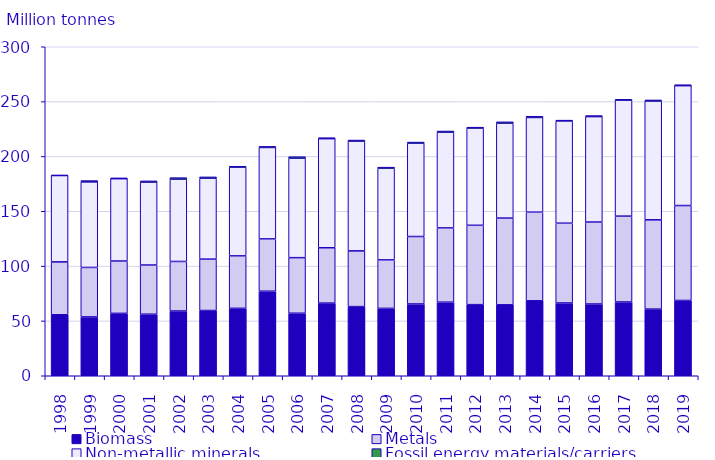
| Category | Biomass | Metals | Non-metallic minerals | Fossil energy materials/carriers |
|---|---|---|---|---|
| 1998.0 | 55.605 | 48.234 | 78.756 | 0.319 |
| 1999.0 | 53.658 | 45.113 | 77.989 | 1.234 |
| 2000.0 | 56.896 | 47.732 | 75.055 | 0.712 |
| 2001.0 | 56.119 | 44.862 | 75.561 | 1.169 |
| 2002.0 | 59.06 | 45.156 | 75.047 | 1.406 |
| 2003.0 | 59.466 | 46.889 | 73.732 | 1.243 |
| 2004.0 | 61.477 | 47.83 | 80.845 | 0.894 |
| 2005.0 | 77.099 | 47.687 | 83.378 | 1 |
| 2006.0 | 57.006 | 50.691 | 90.646 | 1.427 |
| 2007.0 | 66.256 | 50.466 | 99.471 | 0.878 |
| 2008.0 | 63.046 | 50.844 | 99.977 | 1.071 |
| 2009.0 | 61.433 | 44.222 | 83.551 | 1.002 |
| 2010.0 | 65.456 | 61.516 | 85.067 | 1.039 |
| 2011.0 | 67.104 | 67.717 | 87.229 | 1.125 |
| 2012.0 | 64.829 | 72.374 | 88.61 | 0.847 |
| 2013.0 | 64.676 | 79.086 | 86.528 | 1.255 |
| 2014.0 | 68.341 | 80.836 | 86.326 | 1.112 |
| 2015.0 | 66.374 | 72.734 | 93.26 | 0.718 |
| 2016.0 | 65.427 | 74.733 | 96.141 | 0.925 |
| 2017.0 | 67.3 | 78.264 | 105.679 | 0.825 |
| 2018.0 | 60.769 | 81.424 | 108.271 | 1.04 |
| 2019.0 | 68.657 | 86.554 | 109.302 | 0.863 |